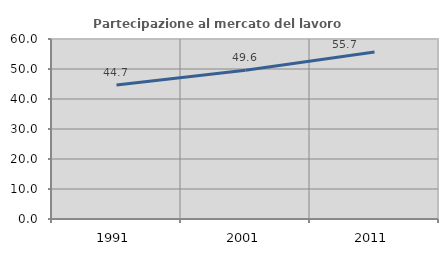
| Category | Partecipazione al mercato del lavoro  femminile |
|---|---|
| 1991.0 | 44.658 |
| 2001.0 | 49.611 |
| 2011.0 | 55.694 |